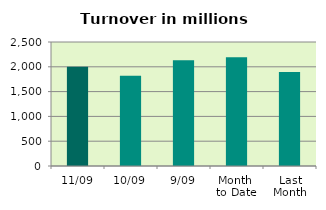
| Category | Series 0 |
|---|---|
| 11/09 | 2001.176 |
| 10/09 | 1819.738 |
| 9/09 | 2130.32 |
| Month 
to Date | 2193.193 |
| Last
Month | 1896.825 |